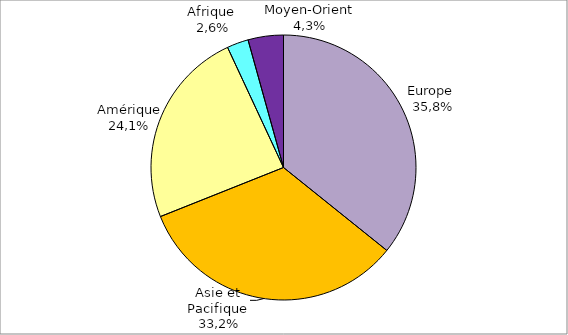
| Category | 2015 |
|---|---|
| Europe | 0.358 |
| Asie et Pacifique | 0.332 |
| Amérique | 0.241 |
| Afrique | 0.026 |
| Moyen-Orient | 0.043 |